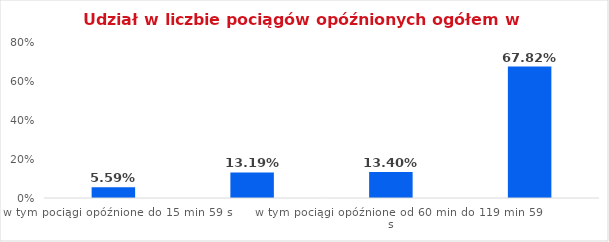
| Category | Series 0 |
|---|---|
| w tym pociągi opóźnione do 15 min 59 s | 0.056 |
| w tym pociągi opóźnione od 16 min do 59 min 59 s | 0.132 |
| w tym pociągi opóźnione od 60 min do 119 min 59 s | 0.134 |
| w tym pociągi opóźnione od 120 min | 0.678 |